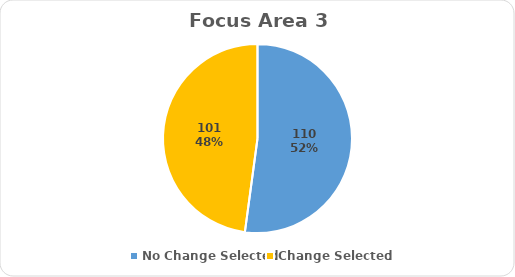
| Category | Series 0 |
|---|---|
| No Change Selected | 110 |
| Change Selected | 101 |